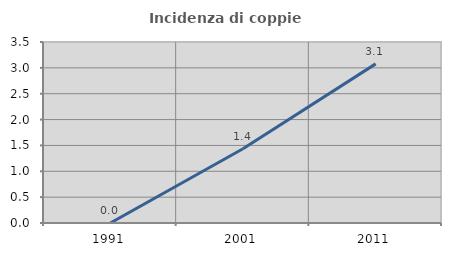
| Category | Incidenza di coppie miste |
|---|---|
| 1991.0 | 0 |
| 2001.0 | 1.435 |
| 2011.0 | 3.077 |